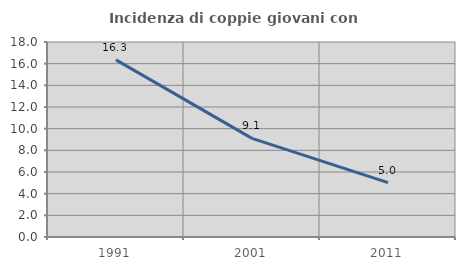
| Category | Incidenza di coppie giovani con figli |
|---|---|
| 1991.0 | 16.348 |
| 2001.0 | 9.102 |
| 2011.0 | 5.013 |